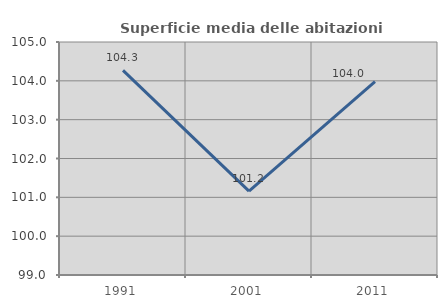
| Category | Superficie media delle abitazioni occupate |
|---|---|
| 1991.0 | 104.269 |
| 2001.0 | 101.16 |
| 2011.0 | 103.98 |